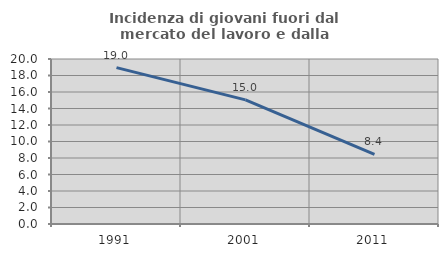
| Category | Incidenza di giovani fuori dal mercato del lavoro e dalla formazione  |
|---|---|
| 1991.0 | 18.953 |
| 2001.0 | 15.049 |
| 2011.0 | 8.447 |